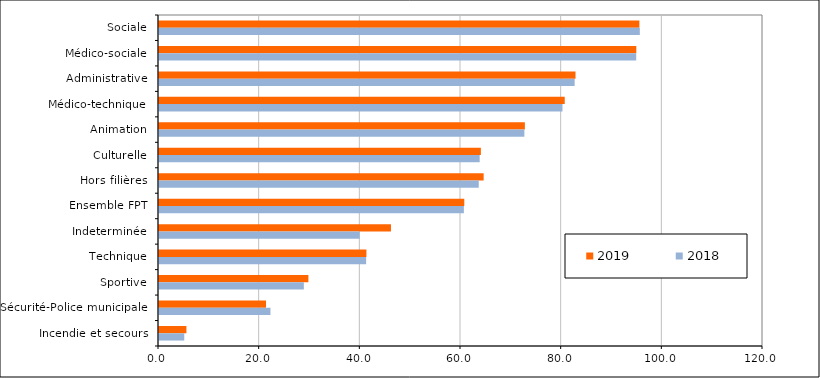
| Category | 2019 | 2018 |
|---|---|---|
| Sociale | 95.44 | 95.53 |
| Médico-sociale | 94.83 | 94.81 |
| Administrative | 82.75 | 82.58 |
| Médico-technique | 80.61 | 80.16 |
| Animation | 72.69 | 72.59 |
| Culturelle | 63.95 | 63.71 |
| Hors filières | 64.5 | 63.53 |
| Ensemble FPT | 60.65 | 60.57 |
| Indeterminée | 46.09 | 39.86 |
| Technique | 41.21 | 41.15 |
| Sportive | 29.68 | 28.78 |
| Sécurité-Police municipale | 21.26 | 22.14 |
| Incendie et secours | 5.45 | 5.02 |